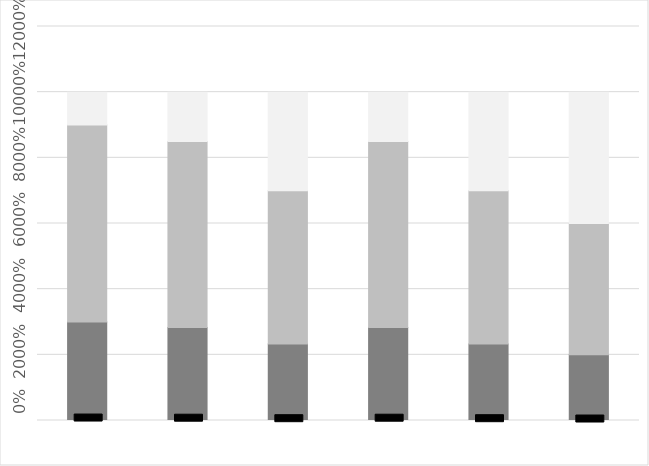
| Category | Źle | Przeciętnie | Dobrze |
|---|---|---|---|
| centralny | 0.3 | 0.6 | 0.1 |
| południowo-zachodni | 0.283 | 0.567 | 0.15 |
| południowy | 0.233 | 0.467 | 0.3 |
| północno-zachodni | 0.283 | 0.567 | 0.15 |
| północny | 0.233 | 0.467 | 0.3 |
| wschodni | 0.2 | 0.4 | 0.4 |